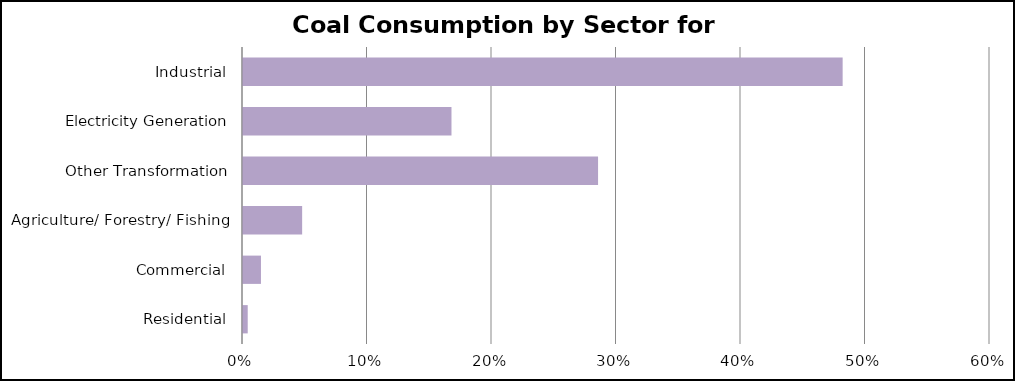
| Category | Coal Consumption by Sector for 2023 |
|---|---|
|  Residential  | 0.004 |
|  Commercial  | 0.014 |
|  Agriculture/ Forestry/ Fishing  | 0.048 |
|  Other Transformation  | 0.285 |
|  Electricity Generation  | 0.167 |
|  Industrial  | 0.482 |